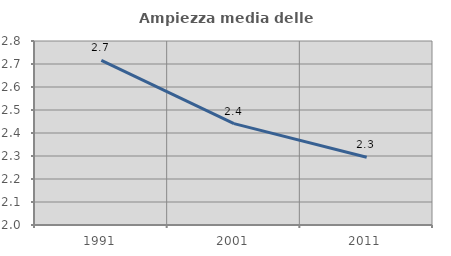
| Category | Ampiezza media delle famiglie |
|---|---|
| 1991.0 | 2.716 |
| 2001.0 | 2.441 |
| 2011.0 | 2.294 |